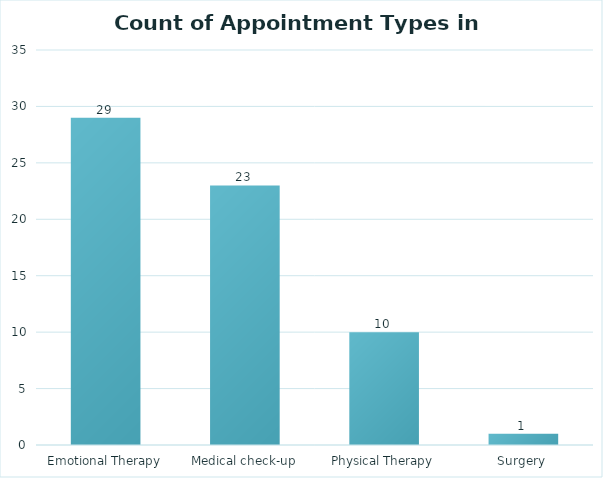
| Category | Count of Appointment Type |
|---|---|
| Emotional Therapy | 29 |
| Medical check-up | 23 |
| Physical Therapy | 10 |
| Surgery | 1 |